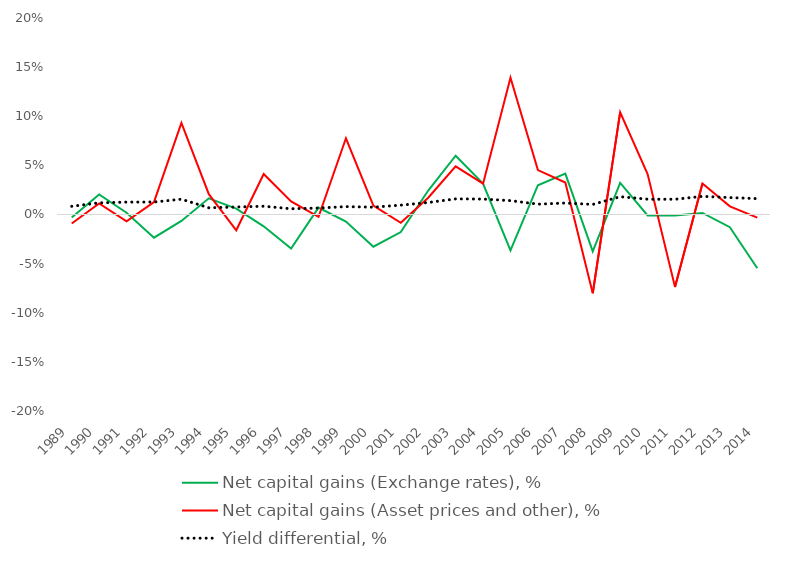
| Category | Net capital gains (Exchange rates), % | Net capital gains (Asset prices and other), % | Yield differential, % |
|---|---|---|---|
| 1989.0 | -0.003 | -0.009 | 0.008 |
| 1990.0 | 0.02 | 0.011 | 0.012 |
| 1991.0 | 0.002 | -0.007 | 0.013 |
| 1992.0 | -0.024 | 0.013 | 0.013 |
| 1993.0 | -0.007 | 0.093 | 0.016 |
| 1994.0 | 0.016 | 0.021 | 0.007 |
| 1995.0 | 0.006 | -0.016 | 0.008 |
| 1996.0 | -0.012 | 0.041 | 0.008 |
| 1997.0 | -0.035 | 0.013 | 0.006 |
| 1998.0 | 0.007 | -0.002 | 0.007 |
| 1999.0 | -0.007 | 0.078 | 0.008 |
| 2000.0 | -0.033 | 0.009 | 0.007 |
| 2001.0 | -0.018 | -0.008 | 0.01 |
| 2002.0 | 0.024 | 0.017 | 0.012 |
| 2003.0 | 0.06 | 0.049 | 0.016 |
| 2004.0 | 0.031 | 0.031 | 0.016 |
| 2005.0 | -0.037 | 0.139 | 0.014 |
| 2006.0 | 0.03 | 0.045 | 0.01 |
| 2007.0 | 0.042 | 0.033 | 0.012 |
| 2008.0 | -0.037 | -0.08 | 0.01 |
| 2009.0 | 0.032 | 0.104 | 0.018 |
| 2010.0 | -0.001 | 0.041 | 0.016 |
| 2011.0 | -0.001 | -0.074 | 0.015 |
| 2012.0 | 0.002 | 0.031 | 0.018 |
| 2013.0 | -0.013 | 0.008 | 0.017 |
| 2014.0 | -0.055 | -0.003 | 0.016 |